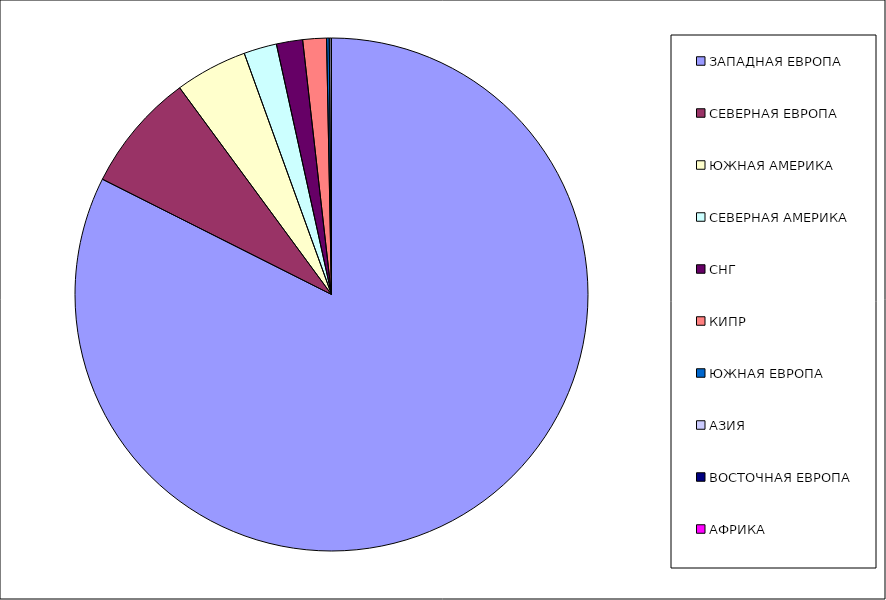
| Category | Оборот |
|---|---|
| ЗАПАДНАЯ ЕВРОПА | 0.824 |
| СЕВЕРНАЯ ЕВРОПА | 0.075 |
| ЮЖНАЯ АМЕРИКА | 0.046 |
| СЕВЕРНАЯ АМЕРИКА | 0.021 |
| СНГ | 0.017 |
| КИПР | 0.015 |
| ЮЖНАЯ ЕВРОПА | 0.002 |
| АЗИЯ | 0.001 |
| ВОСТОЧНАЯ ЕВРОПА | 0 |
| АФРИКА | 0 |